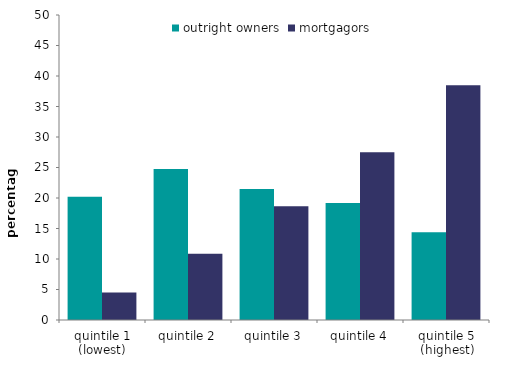
| Category | outright owners | mortgagors |
|---|---|---|
| quintile 1 (lowest) | 20.211 | 4.505 |
| quintile 2 | 24.769 | 10.854 |
| quintile 3 | 21.463 | 18.651 |
| quintile 4 | 19.182 | 27.496 |
| quintile 5 (highest) | 14.374 | 38.495 |